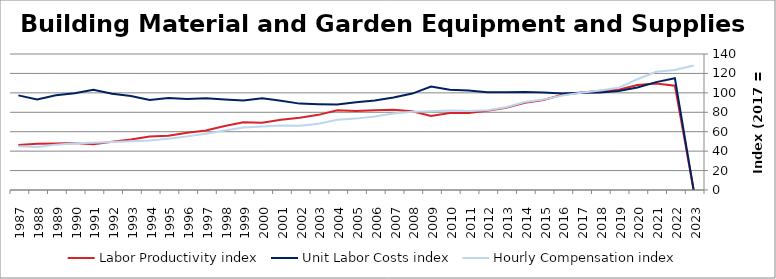
| Category | Labor Productivity index | Unit Labor Costs index | Hourly Compensation index |
|---|---|---|---|
| 2023.0 | 0 | 0 | 128.204 |
| 2022.0 | 107.371 | 115.107 | 123.591 |
| 2021.0 | 109.538 | 111.074 | 121.667 |
| 2020.0 | 107.971 | 105.6 | 114.018 |
| 2019.0 | 103.114 | 101.976 | 105.151 |
| 2018.0 | 102.105 | 100.323 | 102.435 |
| 2017.0 | 100 | 100 | 100 |
| 2016.0 | 98.094 | 99.248 | 97.357 |
| 2015.0 | 92.658 | 100.416 | 93.044 |
| 2014.0 | 89.698 | 100.888 | 90.495 |
| 2013.0 | 84.675 | 100.518 | 85.114 |
| 2012.0 | 81.458 | 100.711 | 82.038 |
| 2011.0 | 79.332 | 102.548 | 81.353 |
| 2010.0 | 79.379 | 103.182 | 81.904 |
| 2009.0 | 76.16 | 106.511 | 81.118 |
| 2008.0 | 81.086 | 99.24 | 80.469 |
| 2007.0 | 82.622 | 95.238 | 78.688 |
| 2006.0 | 82.21 | 92.067 | 75.688 |
| 2005.0 | 81.359 | 90.316 | 73.48 |
| 2004.0 | 82.025 | 88.017 | 72.196 |
| 2003.0 | 77.352 | 88.292 | 68.296 |
| 2002.0 | 74.285 | 88.927 | 66.06 |
| 2001.0 | 72.307 | 91.971 | 66.501 |
| 2000.0 | 69.154 | 94.551 | 65.386 |
| 1999.0 | 69.827 | 92.088 | 64.302 |
| 1998.0 | 65.807 | 93.177 | 61.317 |
| 1997.0 | 61.217 | 94.426 | 57.804 |
| 1996.0 | 58.878 | 93.754 | 55.2 |
| 1995.0 | 55.809 | 94.603 | 52.797 |
| 1994.0 | 55.04 | 92.615 | 50.975 |
| 1993.0 | 51.872 | 96.731 | 50.176 |
| 1992.0 | 49.766 | 99.195 | 49.365 |
| 1991.0 | 47.179 | 103.277 | 48.725 |
| 1990.0 | 48.378 | 99.623 | 48.196 |
| 1989.0 | 47.872 | 97.561 | 46.704 |
| 1988.0 | 47.566 | 93.19 | 44.327 |
| 1987.0 | 46.237 | 97.385 | 45.028 |